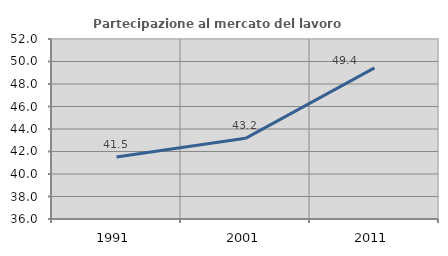
| Category | Partecipazione al mercato del lavoro  femminile |
|---|---|
| 1991.0 | 41.512 |
| 2001.0 | 43.169 |
| 2011.0 | 49.435 |